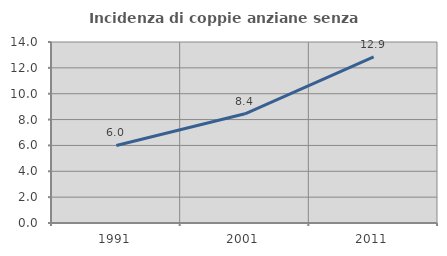
| Category | Incidenza di coppie anziane senza figli  |
|---|---|
| 1991.0 | 5.999 |
| 2001.0 | 8.445 |
| 2011.0 | 12.857 |